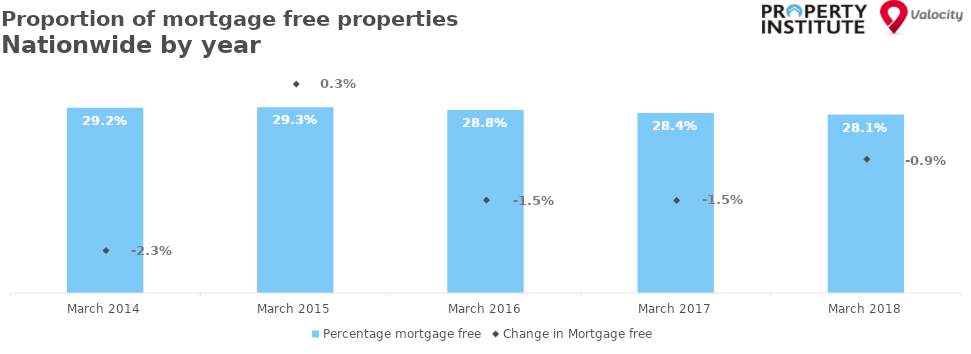
| Category | Percentage mortgage free |
|---|---|
| 2014-03-01 | 0.292 |
| 2015-03-01 | 0.293 |
| 2016-03-01 | 0.288 |
| 2017-03-01 | 0.284 |
| 2018-03-01 | 0.281 |